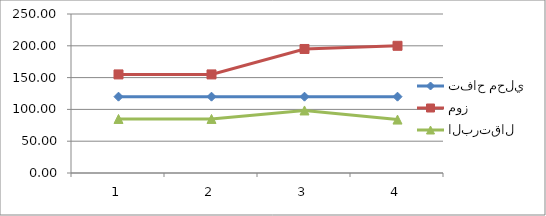
| Category | تفاح محلي | موز | البرتقال |
|---|---|---|---|
| 0 | 120 | 155 | 85 |
| 1 | 120 | 155 | 85 |
| 2 | 120 | 195 | 98.33 |
| 3 | 120 | 200 | 84 |